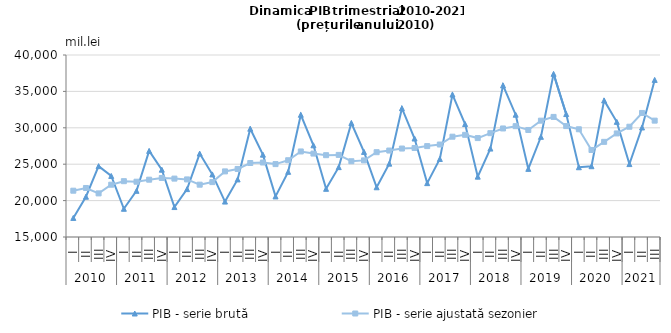
| Category | PIB - serie brută | PIB - serie ajustată sezonier |
|---|---|---|
| 0 | 17618.538 | 21360.1 |
| 1 | 20535.088 | 21731.993 |
| 2 | 24733.989 | 20989.976 |
| 3 | 23387.763 | 22182.179 |
| 4 | 18878.295 | 22667.842 |
| 5 | 21341.813 | 22594.998 |
| 6 | 26828.484 | 22872.715 |
| 7 | 24246.43 | 23103.478 |
| 8 | 19113.189 | 23022.245 |
| 9 | 21579.683 | 22910.476 |
| 10 | 26464.253 | 22185.978 |
| 11 | 23599.498 | 22540.946 |
| 12 | 19867.239 | 24011.652 |
| 13 | 22910.429 | 24346.311 |
| 14 | 29875.092 | 25163.944 |
| 15 | 26311.771 | 25231.733 |
| 16 | 20575.18 | 25013.013 |
| 17 | 23951.428 | 25542.965 |
| 18 | 31790.125 | 26750.923 |
| 19 | 27595.654 | 26460.141 |
| 20 | 21618.259 | 26238.912 |
| 21 | 24596.839 | 26278.666 |
| 22 | 30659.04 | 25404.694 |
| 23 | 26686.781 | 25524.536 |
| 24 | 21830.624 | 26648.884 |
| 25 | 25078.445 | 26875.706 |
| 26 | 32689.956 | 27151.3 |
| 27 | 28527.778 | 27226.362 |
| 28 | 22398.641 | 27485.255 |
| 29 | 25719.356 | 27703.583 |
| 30 | 34566.719 | 28777.075 |
| 31 | 30514.091 | 29034.759 |
| 32 | 23292.847 | 28586.639 |
| 33 | 27146.722 | 29261.33 |
| 34 | 35830.318 | 29908.693 |
| 35 | 31798.143 | 30225.276 |
| 36 | 24359.694 | 29701.083 |
| 37 | 28761.729 | 30979.738 |
| 38 | 37410.428 | 31495.378 |
| 39 | 31885.101 | 30236.441 |
| 40 | 24582.491 | 29798.471 |
| 41 | 24723.055 | 26952.243 |
| 42 | 33764.152 | 28069.662 |
| 43 | 30815.959 | 29226.471 |
| 44 | 25015.77 | 30146.403 |
| 45 | 30045.093 | 32038.814 |
| 46 | 36578.121 | 30985.293 |